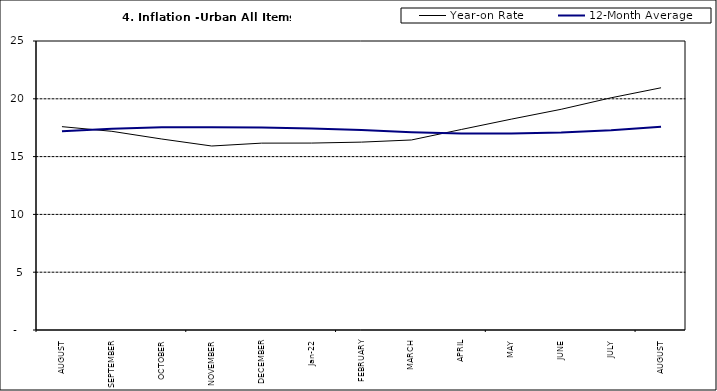
| Category | Year-on Rate | 12-Month Average |
|---|---|---|
| AUGUST | 17.59 | 17.187 |
| SEPTEMBER | 17.187 | 17.411 |
| OCTOBER | 16.52 | 17.534 |
| NOVEMBER | 15.916 | 17.55 |
| DECEMBER | 16.165 | 17.519 |
| Jan-22 | 16.171 | 17.435 |
| FEBRUARY | 16.253 | 17.292 |
| MARCH | 16.438 | 17.103 |
| APRIL | 17.347 | 17.005 |
| MAY | 18.24 | 17.002 |
| JUNE | 19.093 | 17.087 |
| JULY | 20.087 | 17.285 |
| AUGUST | 20.954 | 17.588 |